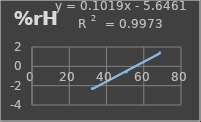
| Category | Humedad |
|---|---|
| 32.3 | -2.3 |
| 50.6 | -0.6 |
| 68.6 | 1.4 |